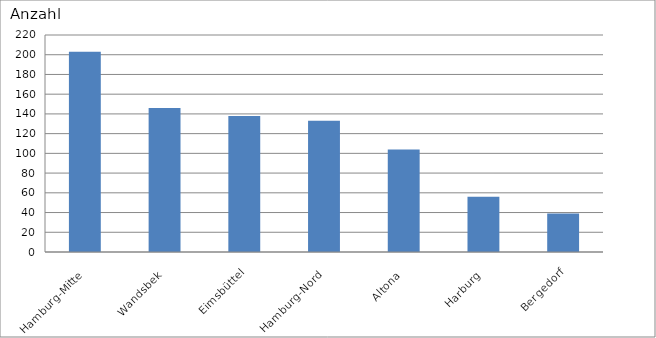
| Category | Hamburg-Mitte |
|---|---|
| Hamburg-Mitte | 203 |
| Wandsbek | 146 |
| Eimsbüttel | 138 |
| Hamburg-Nord | 133 |
| Altona | 104 |
| Harburg | 56 |
| Bergedorf | 39 |